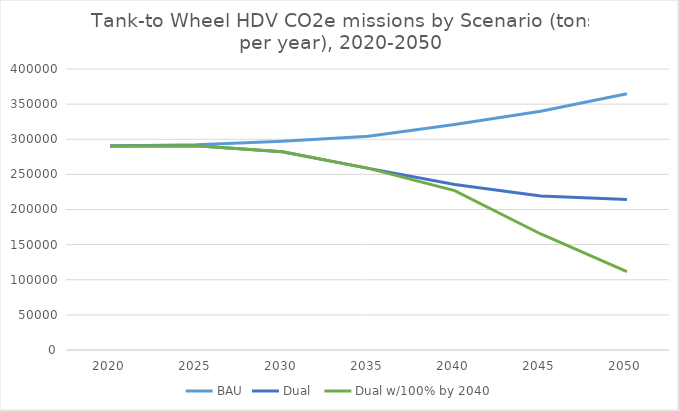
| Category | BAU | Dual  | Dual w/100% by 2040 |
|---|---|---|---|
| 2020.0 | 290439.981 | 290439.981 | 290439.981 |
| 2025.0 | 292155.951 | 290853.885 | 290853.885 |
| 2030.0 | 296982.161 | 282116.353 | 282116.353 |
| 2035.0 | 304315.036 | 258569.753 | 258569.753 |
| 2040.0 | 320858.768 | 235630.602 | 226822.478 |
| 2045.0 | 339759.736 | 219124.405 | 165143.591 |
| 2050.0 | 364688.214 | 214115.893 | 111639.785 |